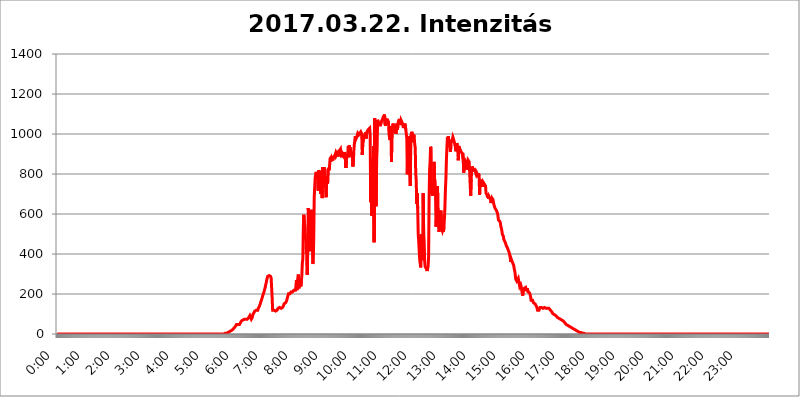
| Category | 2017.03.22. Intenzitás [W/m^2] |
|---|---|
| 0.0 | 0 |
| 0.0006944444444444445 | 0 |
| 0.001388888888888889 | 0 |
| 0.0020833333333333333 | 0 |
| 0.002777777777777778 | 0 |
| 0.003472222222222222 | 0 |
| 0.004166666666666667 | 0 |
| 0.004861111111111111 | 0 |
| 0.005555555555555556 | 0 |
| 0.0062499999999999995 | 0 |
| 0.006944444444444444 | 0 |
| 0.007638888888888889 | 0 |
| 0.008333333333333333 | 0 |
| 0.009027777777777779 | 0 |
| 0.009722222222222222 | 0 |
| 0.010416666666666666 | 0 |
| 0.011111111111111112 | 0 |
| 0.011805555555555555 | 0 |
| 0.012499999999999999 | 0 |
| 0.013194444444444444 | 0 |
| 0.013888888888888888 | 0 |
| 0.014583333333333332 | 0 |
| 0.015277777777777777 | 0 |
| 0.015972222222222224 | 0 |
| 0.016666666666666666 | 0 |
| 0.017361111111111112 | 0 |
| 0.018055555555555557 | 0 |
| 0.01875 | 0 |
| 0.019444444444444445 | 0 |
| 0.02013888888888889 | 0 |
| 0.020833333333333332 | 0 |
| 0.02152777777777778 | 0 |
| 0.022222222222222223 | 0 |
| 0.02291666666666667 | 0 |
| 0.02361111111111111 | 0 |
| 0.024305555555555556 | 0 |
| 0.024999999999999998 | 0 |
| 0.025694444444444447 | 0 |
| 0.02638888888888889 | 0 |
| 0.027083333333333334 | 0 |
| 0.027777777777777776 | 0 |
| 0.02847222222222222 | 0 |
| 0.029166666666666664 | 0 |
| 0.029861111111111113 | 0 |
| 0.030555555555555555 | 0 |
| 0.03125 | 0 |
| 0.03194444444444445 | 0 |
| 0.03263888888888889 | 0 |
| 0.03333333333333333 | 0 |
| 0.034027777777777775 | 0 |
| 0.034722222222222224 | 0 |
| 0.035416666666666666 | 0 |
| 0.036111111111111115 | 0 |
| 0.03680555555555556 | 0 |
| 0.0375 | 0 |
| 0.03819444444444444 | 0 |
| 0.03888888888888889 | 0 |
| 0.03958333333333333 | 0 |
| 0.04027777777777778 | 0 |
| 0.04097222222222222 | 0 |
| 0.041666666666666664 | 0 |
| 0.042361111111111106 | 0 |
| 0.04305555555555556 | 0 |
| 0.043750000000000004 | 0 |
| 0.044444444444444446 | 0 |
| 0.04513888888888889 | 0 |
| 0.04583333333333334 | 0 |
| 0.04652777777777778 | 0 |
| 0.04722222222222222 | 0 |
| 0.04791666666666666 | 0 |
| 0.04861111111111111 | 0 |
| 0.049305555555555554 | 0 |
| 0.049999999999999996 | 0 |
| 0.05069444444444445 | 0 |
| 0.051388888888888894 | 0 |
| 0.052083333333333336 | 0 |
| 0.05277777777777778 | 0 |
| 0.05347222222222222 | 0 |
| 0.05416666666666667 | 0 |
| 0.05486111111111111 | 0 |
| 0.05555555555555555 | 0 |
| 0.05625 | 0 |
| 0.05694444444444444 | 0 |
| 0.057638888888888885 | 0 |
| 0.05833333333333333 | 0 |
| 0.05902777777777778 | 0 |
| 0.059722222222222225 | 0 |
| 0.06041666666666667 | 0 |
| 0.061111111111111116 | 0 |
| 0.06180555555555556 | 0 |
| 0.0625 | 0 |
| 0.06319444444444444 | 0 |
| 0.06388888888888888 | 0 |
| 0.06458333333333334 | 0 |
| 0.06527777777777778 | 0 |
| 0.06597222222222222 | 0 |
| 0.06666666666666667 | 0 |
| 0.06736111111111111 | 0 |
| 0.06805555555555555 | 0 |
| 0.06874999999999999 | 0 |
| 0.06944444444444443 | 0 |
| 0.07013888888888889 | 0 |
| 0.07083333333333333 | 0 |
| 0.07152777777777779 | 0 |
| 0.07222222222222223 | 0 |
| 0.07291666666666667 | 0 |
| 0.07361111111111111 | 0 |
| 0.07430555555555556 | 0 |
| 0.075 | 0 |
| 0.07569444444444444 | 0 |
| 0.0763888888888889 | 0 |
| 0.07708333333333334 | 0 |
| 0.07777777777777778 | 0 |
| 0.07847222222222222 | 0 |
| 0.07916666666666666 | 0 |
| 0.0798611111111111 | 0 |
| 0.08055555555555556 | 0 |
| 0.08125 | 0 |
| 0.08194444444444444 | 0 |
| 0.08263888888888889 | 0 |
| 0.08333333333333333 | 0 |
| 0.08402777777777777 | 0 |
| 0.08472222222222221 | 0 |
| 0.08541666666666665 | 0 |
| 0.08611111111111112 | 0 |
| 0.08680555555555557 | 0 |
| 0.08750000000000001 | 0 |
| 0.08819444444444445 | 0 |
| 0.08888888888888889 | 0 |
| 0.08958333333333333 | 0 |
| 0.09027777777777778 | 0 |
| 0.09097222222222222 | 0 |
| 0.09166666666666667 | 0 |
| 0.09236111111111112 | 0 |
| 0.09305555555555556 | 0 |
| 0.09375 | 0 |
| 0.09444444444444444 | 0 |
| 0.09513888888888888 | 0 |
| 0.09583333333333333 | 0 |
| 0.09652777777777777 | 0 |
| 0.09722222222222222 | 0 |
| 0.09791666666666667 | 0 |
| 0.09861111111111111 | 0 |
| 0.09930555555555555 | 0 |
| 0.09999999999999999 | 0 |
| 0.10069444444444443 | 0 |
| 0.1013888888888889 | 0 |
| 0.10208333333333335 | 0 |
| 0.10277777777777779 | 0 |
| 0.10347222222222223 | 0 |
| 0.10416666666666667 | 0 |
| 0.10486111111111111 | 0 |
| 0.10555555555555556 | 0 |
| 0.10625 | 0 |
| 0.10694444444444444 | 0 |
| 0.1076388888888889 | 0 |
| 0.10833333333333334 | 0 |
| 0.10902777777777778 | 0 |
| 0.10972222222222222 | 0 |
| 0.1111111111111111 | 0 |
| 0.11180555555555556 | 0 |
| 0.11180555555555556 | 0 |
| 0.1125 | 0 |
| 0.11319444444444444 | 0 |
| 0.11388888888888889 | 0 |
| 0.11458333333333333 | 0 |
| 0.11527777777777777 | 0 |
| 0.11597222222222221 | 0 |
| 0.11666666666666665 | 0 |
| 0.1173611111111111 | 0 |
| 0.11805555555555557 | 0 |
| 0.11944444444444445 | 0 |
| 0.12013888888888889 | 0 |
| 0.12083333333333333 | 0 |
| 0.12152777777777778 | 0 |
| 0.12222222222222223 | 0 |
| 0.12291666666666667 | 0 |
| 0.12291666666666667 | 0 |
| 0.12361111111111112 | 0 |
| 0.12430555555555556 | 0 |
| 0.125 | 0 |
| 0.12569444444444444 | 0 |
| 0.12638888888888888 | 0 |
| 0.12708333333333333 | 0 |
| 0.16875 | 0 |
| 0.12847222222222224 | 0 |
| 0.12916666666666668 | 0 |
| 0.12986111111111112 | 0 |
| 0.13055555555555556 | 0 |
| 0.13125 | 0 |
| 0.13194444444444445 | 0 |
| 0.1326388888888889 | 0 |
| 0.13333333333333333 | 0 |
| 0.13402777777777777 | 0 |
| 0.13402777777777777 | 0 |
| 0.13472222222222222 | 0 |
| 0.13541666666666666 | 0 |
| 0.1361111111111111 | 0 |
| 0.13749999999999998 | 0 |
| 0.13819444444444443 | 0 |
| 0.1388888888888889 | 0 |
| 0.13958333333333334 | 0 |
| 0.14027777777777778 | 0 |
| 0.14097222222222222 | 0 |
| 0.14166666666666666 | 0 |
| 0.1423611111111111 | 0 |
| 0.14305555555555557 | 0 |
| 0.14375000000000002 | 0 |
| 0.14444444444444446 | 0 |
| 0.1451388888888889 | 0 |
| 0.1451388888888889 | 0 |
| 0.14652777777777778 | 0 |
| 0.14722222222222223 | 0 |
| 0.14791666666666667 | 0 |
| 0.1486111111111111 | 0 |
| 0.14930555555555555 | 0 |
| 0.15 | 0 |
| 0.15069444444444444 | 0 |
| 0.15138888888888888 | 0 |
| 0.15208333333333332 | 0 |
| 0.15277777777777776 | 0 |
| 0.15347222222222223 | 0 |
| 0.15416666666666667 | 0 |
| 0.15486111111111112 | 0 |
| 0.15555555555555556 | 0 |
| 0.15625 | 0 |
| 0.15694444444444444 | 0 |
| 0.15763888888888888 | 0 |
| 0.15833333333333333 | 0 |
| 0.15902777777777777 | 0 |
| 0.15972222222222224 | 0 |
| 0.16041666666666668 | 0 |
| 0.16111111111111112 | 0 |
| 0.16180555555555556 | 0 |
| 0.1625 | 0 |
| 0.16319444444444445 | 0 |
| 0.1638888888888889 | 0 |
| 0.16458333333333333 | 0 |
| 0.16527777777777777 | 0 |
| 0.16597222222222222 | 0 |
| 0.16666666666666666 | 0 |
| 0.1673611111111111 | 0 |
| 0.16805555555555554 | 0 |
| 0.16874999999999998 | 0 |
| 0.16944444444444443 | 0 |
| 0.17013888888888887 | 0 |
| 0.1708333333333333 | 0 |
| 0.17152777777777775 | 0 |
| 0.17222222222222225 | 0 |
| 0.1729166666666667 | 0 |
| 0.17361111111111113 | 0 |
| 0.17430555555555557 | 0 |
| 0.17500000000000002 | 0 |
| 0.17569444444444446 | 0 |
| 0.1763888888888889 | 0 |
| 0.17708333333333334 | 0 |
| 0.17777777777777778 | 0 |
| 0.17847222222222223 | 0 |
| 0.17916666666666667 | 0 |
| 0.1798611111111111 | 0 |
| 0.18055555555555555 | 0 |
| 0.18125 | 0 |
| 0.18194444444444444 | 0 |
| 0.1826388888888889 | 0 |
| 0.18333333333333335 | 0 |
| 0.1840277777777778 | 0 |
| 0.18472222222222223 | 0 |
| 0.18541666666666667 | 0 |
| 0.18611111111111112 | 0 |
| 0.18680555555555556 | 0 |
| 0.1875 | 0 |
| 0.18819444444444444 | 0 |
| 0.18888888888888888 | 0 |
| 0.18958333333333333 | 0 |
| 0.19027777777777777 | 0 |
| 0.1909722222222222 | 0 |
| 0.19166666666666665 | 0 |
| 0.19236111111111112 | 0 |
| 0.19305555555555554 | 0 |
| 0.19375 | 0 |
| 0.19444444444444445 | 0 |
| 0.1951388888888889 | 0 |
| 0.19583333333333333 | 0 |
| 0.19652777777777777 | 0 |
| 0.19722222222222222 | 0 |
| 0.19791666666666666 | 0 |
| 0.1986111111111111 | 0 |
| 0.19930555555555554 | 0 |
| 0.19999999999999998 | 0 |
| 0.20069444444444443 | 0 |
| 0.20138888888888887 | 0 |
| 0.2020833333333333 | 0 |
| 0.2027777777777778 | 0 |
| 0.2034722222222222 | 0 |
| 0.2041666666666667 | 0 |
| 0.20486111111111113 | 0 |
| 0.20555555555555557 | 0 |
| 0.20625000000000002 | 0 |
| 0.20694444444444446 | 0 |
| 0.2076388888888889 | 0 |
| 0.20833333333333334 | 0 |
| 0.20902777777777778 | 0 |
| 0.20972222222222223 | 0 |
| 0.21041666666666667 | 0 |
| 0.2111111111111111 | 0 |
| 0.21180555555555555 | 0 |
| 0.2125 | 0 |
| 0.21319444444444444 | 0 |
| 0.2138888888888889 | 0 |
| 0.21458333333333335 | 0 |
| 0.2152777777777778 | 0 |
| 0.21597222222222223 | 0 |
| 0.21666666666666667 | 0 |
| 0.21736111111111112 | 0 |
| 0.21805555555555556 | 0 |
| 0.21875 | 0 |
| 0.21944444444444444 | 0 |
| 0.22013888888888888 | 0 |
| 0.22083333333333333 | 0 |
| 0.22152777777777777 | 0 |
| 0.2222222222222222 | 0 |
| 0.22291666666666665 | 0 |
| 0.2236111111111111 | 0 |
| 0.22430555555555556 | 0 |
| 0.225 | 0 |
| 0.22569444444444445 | 0 |
| 0.2263888888888889 | 0 |
| 0.22708333333333333 | 0 |
| 0.22777777777777777 | 0 |
| 0.22847222222222222 | 0 |
| 0.22916666666666666 | 0 |
| 0.2298611111111111 | 0 |
| 0.23055555555555554 | 0 |
| 0.23124999999999998 | 0 |
| 0.23194444444444443 | 0 |
| 0.23263888888888887 | 0 |
| 0.2333333333333333 | 0 |
| 0.2340277777777778 | 0 |
| 0.2347222222222222 | 0 |
| 0.2354166666666667 | 3.525 |
| 0.23611111111111113 | 3.525 |
| 0.23680555555555557 | 3.525 |
| 0.23750000000000002 | 3.525 |
| 0.23819444444444446 | 3.525 |
| 0.2388888888888889 | 3.525 |
| 0.23958333333333334 | 7.887 |
| 0.24027777777777778 | 7.887 |
| 0.24097222222222223 | 12.257 |
| 0.24166666666666667 | 12.257 |
| 0.2423611111111111 | 12.257 |
| 0.24305555555555555 | 12.257 |
| 0.24375 | 16.636 |
| 0.24444444444444446 | 16.636 |
| 0.24513888888888888 | 21.024 |
| 0.24583333333333335 | 21.024 |
| 0.2465277777777778 | 25.419 |
| 0.24722222222222223 | 25.419 |
| 0.24791666666666667 | 29.823 |
| 0.24861111111111112 | 34.234 |
| 0.24930555555555556 | 34.234 |
| 0.25 | 38.653 |
| 0.25069444444444444 | 43.079 |
| 0.2513888888888889 | 47.511 |
| 0.2520833333333333 | 47.511 |
| 0.25277777777777777 | 47.511 |
| 0.2534722222222222 | 47.511 |
| 0.25416666666666665 | 47.511 |
| 0.2548611111111111 | 47.511 |
| 0.2555555555555556 | 47.511 |
| 0.25625000000000003 | 51.951 |
| 0.2569444444444445 | 56.398 |
| 0.2576388888888889 | 60.85 |
| 0.25833333333333336 | 65.31 |
| 0.2590277777777778 | 65.31 |
| 0.25972222222222224 | 69.775 |
| 0.2604166666666667 | 69.775 |
| 0.2611111111111111 | 74.246 |
| 0.26180555555555557 | 74.246 |
| 0.2625 | 74.246 |
| 0.26319444444444445 | 74.246 |
| 0.2638888888888889 | 74.246 |
| 0.26458333333333334 | 74.246 |
| 0.2652777777777778 | 69.775 |
| 0.2659722222222222 | 69.775 |
| 0.26666666666666666 | 74.246 |
| 0.2673611111111111 | 74.246 |
| 0.26805555555555555 | 78.722 |
| 0.26875 | 83.205 |
| 0.26944444444444443 | 87.692 |
| 0.2701388888888889 | 92.184 |
| 0.2708333333333333 | 92.184 |
| 0.27152777777777776 | 87.692 |
| 0.2722222222222222 | 74.246 |
| 0.27291666666666664 | 78.722 |
| 0.2736111111111111 | 83.205 |
| 0.2743055555555555 | 96.682 |
| 0.27499999999999997 | 101.184 |
| 0.27569444444444446 | 105.69 |
| 0.27638888888888885 | 110.201 |
| 0.27708333333333335 | 114.716 |
| 0.2777777777777778 | 119.235 |
| 0.27847222222222223 | 119.235 |
| 0.2791666666666667 | 119.235 |
| 0.2798611111111111 | 123.758 |
| 0.28055555555555556 | 123.758 |
| 0.28125 | 119.235 |
| 0.28194444444444444 | 128.284 |
| 0.2826388888888889 | 132.814 |
| 0.2833333333333333 | 137.347 |
| 0.28402777777777777 | 141.884 |
| 0.2847222222222222 | 150.964 |
| 0.28541666666666665 | 160.056 |
| 0.28611111111111115 | 164.605 |
| 0.28680555555555554 | 173.709 |
| 0.28750000000000003 | 182.82 |
| 0.2881944444444445 | 191.937 |
| 0.2888888888888889 | 196.497 |
| 0.28958333333333336 | 205.62 |
| 0.2902777777777778 | 214.746 |
| 0.29097222222222224 | 219.309 |
| 0.2916666666666667 | 233 |
| 0.2923611111111111 | 246.689 |
| 0.29305555555555557 | 255.813 |
| 0.29375 | 269.49 |
| 0.29444444444444445 | 274.047 |
| 0.2951388888888889 | 287.709 |
| 0.29583333333333334 | 287.709 |
| 0.2965277777777778 | 292.259 |
| 0.2972222222222222 | 292.259 |
| 0.29791666666666666 | 296.808 |
| 0.2986111111111111 | 292.259 |
| 0.29930555555555555 | 287.709 |
| 0.3 | 278.603 |
| 0.30069444444444443 | 278.603 |
| 0.3013888888888889 | 182.82 |
| 0.3020833333333333 | 119.235 |
| 0.30277777777777776 | 119.235 |
| 0.3034722222222222 | 119.235 |
| 0.30416666666666664 | 119.235 |
| 0.3048611111111111 | 114.716 |
| 0.3055555555555555 | 114.716 |
| 0.30624999999999997 | 114.716 |
| 0.3069444444444444 | 114.716 |
| 0.3076388888888889 | 119.235 |
| 0.30833333333333335 | 119.235 |
| 0.3090277777777778 | 123.758 |
| 0.30972222222222223 | 128.284 |
| 0.3104166666666667 | 128.284 |
| 0.3111111111111111 | 132.814 |
| 0.31180555555555556 | 132.814 |
| 0.3125 | 132.814 |
| 0.31319444444444444 | 132.814 |
| 0.3138888888888889 | 128.284 |
| 0.3145833333333333 | 128.284 |
| 0.31527777777777777 | 128.284 |
| 0.3159722222222222 | 132.814 |
| 0.31666666666666665 | 137.347 |
| 0.31736111111111115 | 141.884 |
| 0.31805555555555554 | 150.964 |
| 0.31875000000000003 | 150.964 |
| 0.3194444444444445 | 155.509 |
| 0.3201388888888889 | 155.509 |
| 0.32083333333333336 | 155.509 |
| 0.3215277777777778 | 164.605 |
| 0.32222222222222224 | 173.709 |
| 0.3229166666666667 | 182.82 |
| 0.3236111111111111 | 191.937 |
| 0.32430555555555557 | 201.058 |
| 0.325 | 205.62 |
| 0.32569444444444445 | 205.62 |
| 0.3263888888888889 | 201.058 |
| 0.32708333333333334 | 205.62 |
| 0.3277777777777778 | 210.182 |
| 0.3284722222222222 | 210.182 |
| 0.32916666666666666 | 210.182 |
| 0.3298611111111111 | 210.182 |
| 0.33055555555555555 | 210.182 |
| 0.33125 | 210.182 |
| 0.33194444444444443 | 219.309 |
| 0.3326388888888889 | 214.746 |
| 0.3333333333333333 | 214.746 |
| 0.3340277777777778 | 219.309 |
| 0.3347222222222222 | 237.564 |
| 0.3354166666666667 | 269.49 |
| 0.3361111111111111 | 219.309 |
| 0.3368055555555556 | 214.746 |
| 0.33749999999999997 | 223.873 |
| 0.33819444444444446 | 296.808 |
| 0.33888888888888885 | 228.436 |
| 0.33958333333333335 | 233 |
| 0.34027777777777773 | 260.373 |
| 0.34097222222222223 | 246.689 |
| 0.3416666666666666 | 237.564 |
| 0.3423611111111111 | 264.932 |
| 0.3430555555555555 | 292.259 |
| 0.34375 | 355.712 |
| 0.3444444444444445 | 373.729 |
| 0.3451388888888889 | 532.513 |
| 0.3458333333333334 | 596.45 |
| 0.34652777777777777 | 553.986 |
| 0.34722222222222227 | 541.121 |
| 0.34791666666666665 | 480.356 |
| 0.34861111111111115 | 471.582 |
| 0.34930555555555554 | 400.638 |
| 0.35000000000000003 | 431.833 |
| 0.3506944444444444 | 296.808 |
| 0.3513888888888889 | 471.582 |
| 0.3520833333333333 | 629.948 |
| 0.3527777777777778 | 583.779 |
| 0.3534722222222222 | 558.261 |
| 0.3541666666666667 | 422.943 |
| 0.3548611111111111 | 414.035 |
| 0.35555555555555557 | 592.233 |
| 0.35625 | 592.233 |
| 0.35694444444444445 | 621.613 |
| 0.3576388888888889 | 519.555 |
| 0.35833333333333334 | 351.198 |
| 0.3590277777777778 | 360.221 |
| 0.3597222222222222 | 475.972 |
| 0.36041666666666666 | 683.473 |
| 0.3611111111111111 | 735.89 |
| 0.36180555555555555 | 783.342 |
| 0.3625 | 783.342 |
| 0.36319444444444443 | 810.641 |
| 0.3638888888888889 | 791.169 |
| 0.3645833333333333 | 791.169 |
| 0.3652777777777778 | 775.492 |
| 0.3659722222222222 | 715.858 |
| 0.3666666666666667 | 818.392 |
| 0.3673611111111111 | 814.519 |
| 0.3680555555555556 | 806.757 |
| 0.36874999999999997 | 767.62 |
| 0.36944444444444446 | 699.717 |
| 0.37013888888888885 | 814.519 |
| 0.37083333333333335 | 798.974 |
| 0.37152777777777773 | 679.395 |
| 0.37222222222222223 | 833.834 |
| 0.3729166666666666 | 833.834 |
| 0.3736111111111111 | 810.641 |
| 0.3743055555555555 | 833.834 |
| 0.375 | 791.169 |
| 0.3756944444444445 | 759.723 |
| 0.3763888888888889 | 731.896 |
| 0.3770833333333334 | 683.473 |
| 0.37777777777777777 | 759.723 |
| 0.37847222222222227 | 787.258 |
| 0.37916666666666665 | 751.803 |
| 0.37986111111111115 | 822.26 |
| 0.38055555555555554 | 829.981 |
| 0.38125000000000003 | 818.392 |
| 0.3819444444444444 | 841.526 |
| 0.3826388888888889 | 875.918 |
| 0.3833333333333333 | 879.719 |
| 0.3840277777777778 | 883.516 |
| 0.3847222222222222 | 868.305 |
| 0.3854166666666667 | 868.305 |
| 0.3861111111111111 | 872.114 |
| 0.38680555555555557 | 872.114 |
| 0.3875 | 868.305 |
| 0.38819444444444445 | 887.309 |
| 0.3888888888888889 | 891.099 |
| 0.38958333333333334 | 894.885 |
| 0.3902777777777778 | 902.447 |
| 0.3909722222222222 | 891.099 |
| 0.39166666666666666 | 894.885 |
| 0.3923611111111111 | 902.447 |
| 0.39305555555555555 | 906.223 |
| 0.39375 | 887.309 |
| 0.39444444444444443 | 906.223 |
| 0.3951388888888889 | 913.766 |
| 0.3958333333333333 | 909.996 |
| 0.3965277777777778 | 913.766 |
| 0.3972222222222222 | 925.06 |
| 0.3979166666666667 | 898.668 |
| 0.3986111111111111 | 883.516 |
| 0.3993055555555556 | 906.223 |
| 0.39999999999999997 | 906.223 |
| 0.40069444444444446 | 902.447 |
| 0.40138888888888885 | 891.099 |
| 0.40208333333333335 | 898.668 |
| 0.40277777777777773 | 909.996 |
| 0.40347222222222223 | 883.516 |
| 0.4041666666666666 | 891.099 |
| 0.4048611111111111 | 829.981 |
| 0.4055555555555555 | 868.305 |
| 0.40625 | 887.309 |
| 0.4069444444444445 | 894.885 |
| 0.4076388888888889 | 887.309 |
| 0.4083333333333334 | 940.082 |
| 0.40902777777777777 | 883.516 |
| 0.40972222222222227 | 943.832 |
| 0.41041666666666665 | 921.298 |
| 0.41111111111111115 | 932.576 |
| 0.41180555555555554 | 891.099 |
| 0.41250000000000003 | 909.996 |
| 0.4131944444444444 | 894.885 |
| 0.4138888888888889 | 906.223 |
| 0.4145833333333333 | 837.682 |
| 0.4152777777777778 | 853.029 |
| 0.4159722222222222 | 917.534 |
| 0.4166666666666667 | 947.58 |
| 0.4173611111111111 | 970.034 |
| 0.41805555555555557 | 988.714 |
| 0.41875 | 973.772 |
| 0.41944444444444445 | 977.508 |
| 0.4201388888888889 | 984.98 |
| 0.42083333333333334 | 988.714 |
| 0.4215277777777778 | 1003.65 |
| 0.4222222222222222 | 999.916 |
| 0.42291666666666666 | 996.182 |
| 0.4236111111111111 | 999.916 |
| 0.42430555555555555 | 1003.65 |
| 0.425 | 1003.65 |
| 0.42569444444444443 | 1011.118 |
| 0.4263888888888889 | 1011.118 |
| 0.4270833333333333 | 999.916 |
| 0.4277777777777778 | 894.885 |
| 0.4284722222222222 | 947.58 |
| 0.4291666666666667 | 984.98 |
| 0.4298611111111111 | 977.508 |
| 0.4305555555555556 | 988.714 |
| 0.43124999999999997 | 996.182 |
| 0.43194444444444446 | 999.916 |
| 0.43263888888888885 | 1007.383 |
| 0.43333333333333335 | 977.508 |
| 0.43402777777777773 | 1007.383 |
| 0.43472222222222223 | 1003.65 |
| 0.4354166666666666 | 1007.383 |
| 0.4361111111111111 | 1022.323 |
| 0.4368055555555555 | 1022.323 |
| 0.4375 | 1018.587 |
| 0.4381944444444445 | 1029.798 |
| 0.4388888888888889 | 992.448 |
| 0.4395833333333334 | 658.909 |
| 0.44027777777777777 | 875.918 |
| 0.44097222222222227 | 592.233 |
| 0.44166666666666665 | 783.342 |
| 0.44236111111111115 | 650.667 |
| 0.44305555555555554 | 845.365 |
| 0.44375000000000003 | 940.082 |
| 0.4444444444444444 | 458.38 |
| 0.4451388888888889 | 1078.555 |
| 0.4458333333333333 | 1037.277 |
| 0.4465277777777778 | 751.803 |
| 0.4472222222222222 | 638.256 |
| 0.4479166666666667 | 868.305 |
| 0.4486111111111111 | 928.819 |
| 0.44930555555555557 | 1071.027 |
| 0.45 | 1067.267 |
| 0.45069444444444445 | 1052.255 |
| 0.4513888888888889 | 1044.762 |
| 0.45208333333333334 | 1048.508 |
| 0.4527777777777778 | 1044.762 |
| 0.4534722222222222 | 1044.762 |
| 0.45416666666666666 | 1041.019 |
| 0.4548611111111111 | 1063.51 |
| 0.45555555555555555 | 1067.267 |
| 0.45625 | 1074.789 |
| 0.45694444444444443 | 1082.324 |
| 0.4576388888888889 | 1086.097 |
| 0.4583333333333333 | 1082.324 |
| 0.4590277777777778 | 1097.437 |
| 0.4597222222222222 | 1048.508 |
| 0.4604166666666667 | 1041.019 |
| 0.4611111111111111 | 1071.027 |
| 0.4618055555555556 | 1074.789 |
| 0.46249999999999997 | 1074.789 |
| 0.46319444444444446 | 1071.027 |
| 0.46388888888888885 | 1071.027 |
| 0.46458333333333335 | 1059.756 |
| 0.46527777777777773 | 999.916 |
| 0.46597222222222223 | 999.916 |
| 0.4666666666666666 | 970.034 |
| 0.4673611111111111 | 1037.277 |
| 0.4680555555555555 | 1011.118 |
| 0.46875 | 860.676 |
| 0.4694444444444445 | 1003.65 |
| 0.4701388888888889 | 1014.852 |
| 0.4708333333333334 | 1052.255 |
| 0.47152777777777777 | 1037.277 |
| 0.47222222222222227 | 1022.323 |
| 0.47291666666666665 | 1007.383 |
| 0.47361111111111115 | 1041.019 |
| 0.47430555555555554 | 1029.798 |
| 0.47500000000000003 | 999.916 |
| 0.4756944444444444 | 1003.65 |
| 0.4763888888888889 | 1052.255 |
| 0.4770833333333333 | 1022.323 |
| 0.4777777777777778 | 1041.019 |
| 0.4784722222222222 | 1063.51 |
| 0.4791666666666667 | 1067.267 |
| 0.4798611111111111 | 1074.789 |
| 0.48055555555555557 | 1044.762 |
| 0.48125 | 1059.756 |
| 0.48194444444444445 | 1071.027 |
| 0.4826388888888889 | 1074.789 |
| 0.48333333333333334 | 1059.756 |
| 0.4840277777777778 | 1059.756 |
| 0.4847222222222222 | 1048.508 |
| 0.48541666666666666 | 1029.798 |
| 0.4861111111111111 | 1026.06 |
| 0.48680555555555555 | 1026.06 |
| 0.4875 | 1052.255 |
| 0.48819444444444443 | 1048.508 |
| 0.4888888888888889 | 1022.323 |
| 0.4895833333333333 | 999.916 |
| 0.4902777777777778 | 977.508 |
| 0.4909722222222222 | 798.974 |
| 0.4916666666666667 | 962.555 |
| 0.4923611111111111 | 868.305 |
| 0.4930555555555556 | 798.974 |
| 0.49374999999999997 | 988.714 |
| 0.49444444444444446 | 798.974 |
| 0.49513888888888885 | 739.877 |
| 0.49583333333333335 | 988.714 |
| 0.49652777777777773 | 992.448 |
| 0.49722222222222223 | 1011.118 |
| 0.4979166666666666 | 1007.383 |
| 0.4986111111111111 | 988.714 |
| 0.4993055555555555 | 958.814 |
| 0.5 | 996.182 |
| 0.5006944444444444 | 981.244 |
| 0.5013888888888889 | 947.58 |
| 0.5020833333333333 | 932.576 |
| 0.5027777777777778 | 802.868 |
| 0.5034722222222222 | 767.62 |
| 0.5041666666666667 | 650.667 |
| 0.5048611111111111 | 703.762 |
| 0.5055555555555555 | 625.784 |
| 0.50625 | 502.192 |
| 0.5069444444444444 | 462.786 |
| 0.5076388888888889 | 418.492 |
| 0.5083333333333333 | 373.729 |
| 0.5090277777777777 | 378.224 |
| 0.5097222222222222 | 333.113 |
| 0.5104166666666666 | 497.836 |
| 0.5111111111111112 | 418.492 |
| 0.5118055555555555 | 369.23 |
| 0.5125000000000001 | 400.638 |
| 0.5131944444444444 | 703.762 |
| 0.513888888888889 | 506.542 |
| 0.5145833333333333 | 467.187 |
| 0.5152777777777778 | 364.728 |
| 0.5159722222222222 | 337.639 |
| 0.5166666666666667 | 342.162 |
| 0.517361111111111 | 333.113 |
| 0.5180555555555556 | 324.052 |
| 0.5187499999999999 | 314.98 |
| 0.5194444444444445 | 328.584 |
| 0.5201388888888888 | 337.639 |
| 0.5208333333333334 | 387.202 |
| 0.5215277777777778 | 675.311 |
| 0.5222222222222223 | 822.26 |
| 0.5229166666666667 | 860.676 |
| 0.5236111111111111 | 936.33 |
| 0.5243055555555556 | 928.819 |
| 0.525 | 703.762 |
| 0.5256944444444445 | 699.717 |
| 0.5263888888888889 | 691.608 |
| 0.5270833333333333 | 711.832 |
| 0.5277777777777778 | 735.89 |
| 0.5284722222222222 | 860.676 |
| 0.5291666666666667 | 775.492 |
| 0.5298611111111111 | 767.62 |
| 0.5305555555555556 | 695.666 |
| 0.53125 | 536.82 |
| 0.5319444444444444 | 579.542 |
| 0.5326388888888889 | 715.858 |
| 0.5333333333333333 | 739.877 |
| 0.5340277777777778 | 592.233 |
| 0.5347222222222222 | 583.779 |
| 0.5354166666666667 | 510.885 |
| 0.5361111111111111 | 541.121 |
| 0.5368055555555555 | 532.513 |
| 0.5375 | 609.062 |
| 0.5381944444444444 | 617.436 |
| 0.5388888888888889 | 545.416 |
| 0.5395833333333333 | 523.88 |
| 0.5402777777777777 | 515.223 |
| 0.5409722222222222 | 523.88 |
| 0.5416666666666666 | 510.885 |
| 0.5423611111111112 | 536.82 |
| 0.5430555555555555 | 579.542 |
| 0.5437500000000001 | 638.256 |
| 0.5444444444444444 | 723.889 |
| 0.545138888888889 | 779.42 |
| 0.5458333333333333 | 872.114 |
| 0.5465277777777778 | 932.576 |
| 0.5472222222222222 | 984.98 |
| 0.5479166666666667 | 973.772 |
| 0.548611111111111 | 988.714 |
| 0.5493055555555556 | 955.071 |
| 0.5499999999999999 | 966.295 |
| 0.5506944444444445 | 932.576 |
| 0.5513888888888888 | 909.996 |
| 0.5520833333333334 | 943.832 |
| 0.5527777777777778 | 966.295 |
| 0.5534722222222223 | 962.555 |
| 0.5541666666666667 | 973.772 |
| 0.5548611111111111 | 984.98 |
| 0.5555555555555556 | 977.508 |
| 0.55625 | 977.508 |
| 0.5569444444444445 | 958.814 |
| 0.5576388888888889 | 947.58 |
| 0.5583333333333333 | 936.33 |
| 0.5590277777777778 | 913.766 |
| 0.5597222222222222 | 917.534 |
| 0.5604166666666667 | 955.071 |
| 0.5611111111111111 | 951.327 |
| 0.5618055555555556 | 913.766 |
| 0.5625 | 868.305 |
| 0.5631944444444444 | 940.082 |
| 0.5638888888888889 | 928.819 |
| 0.5645833333333333 | 925.06 |
| 0.5652777777777778 | 921.298 |
| 0.5659722222222222 | 913.766 |
| 0.5666666666666667 | 909.996 |
| 0.5673611111111111 | 906.223 |
| 0.5680555555555555 | 898.668 |
| 0.56875 | 906.223 |
| 0.5694444444444444 | 864.493 |
| 0.5701388888888889 | 806.757 |
| 0.5708333333333333 | 845.365 |
| 0.5715277777777777 | 856.855 |
| 0.5722222222222222 | 868.305 |
| 0.5729166666666666 | 872.114 |
| 0.5736111111111112 | 860.676 |
| 0.5743055555555555 | 822.26 |
| 0.5750000000000001 | 853.029 |
| 0.5756944444444444 | 822.26 |
| 0.576388888888889 | 868.305 |
| 0.5770833333333333 | 864.493 |
| 0.5777777777777778 | 860.676 |
| 0.5784722222222222 | 860.676 |
| 0.5791666666666667 | 864.493 |
| 0.579861111111111 | 691.608 |
| 0.5805555555555556 | 771.559 |
| 0.5812499999999999 | 818.392 |
| 0.5819444444444445 | 837.682 |
| 0.5826388888888888 | 829.981 |
| 0.5833333333333334 | 818.392 |
| 0.5840277777777778 | 818.392 |
| 0.5847222222222223 | 822.26 |
| 0.5854166666666667 | 822.26 |
| 0.5861111111111111 | 814.519 |
| 0.5868055555555556 | 810.641 |
| 0.5875 | 798.974 |
| 0.5881944444444445 | 806.757 |
| 0.5888888888888889 | 802.868 |
| 0.5895833333333333 | 795.074 |
| 0.5902777777777778 | 783.342 |
| 0.5909722222222222 | 802.868 |
| 0.5916666666666667 | 787.258 |
| 0.5923611111111111 | 695.666 |
| 0.5930555555555556 | 771.559 |
| 0.59375 | 771.559 |
| 0.5944444444444444 | 759.723 |
| 0.5951388888888889 | 755.766 |
| 0.5958333333333333 | 743.859 |
| 0.5965277777777778 | 735.89 |
| 0.5972222222222222 | 759.723 |
| 0.5979166666666667 | 763.674 |
| 0.5986111111111111 | 759.723 |
| 0.5993055555555555 | 747.834 |
| 0.6 | 747.834 |
| 0.6006944444444444 | 739.877 |
| 0.6013888888888889 | 703.762 |
| 0.6020833333333333 | 703.762 |
| 0.6027777777777777 | 695.666 |
| 0.6034722222222222 | 683.473 |
| 0.6041666666666666 | 695.666 |
| 0.6048611111111112 | 675.311 |
| 0.6055555555555555 | 687.544 |
| 0.6062500000000001 | 687.544 |
| 0.6069444444444444 | 687.544 |
| 0.607638888888889 | 671.22 |
| 0.6083333333333333 | 654.791 |
| 0.6090277777777778 | 658.909 |
| 0.6097222222222222 | 679.395 |
| 0.6104166666666667 | 675.311 |
| 0.611111111111111 | 671.22 |
| 0.6118055555555556 | 658.909 |
| 0.6124999999999999 | 646.537 |
| 0.6131944444444445 | 642.4 |
| 0.6138888888888888 | 629.948 |
| 0.6145833333333334 | 625.784 |
| 0.6152777777777778 | 625.784 |
| 0.6159722222222223 | 617.436 |
| 0.6166666666666667 | 617.436 |
| 0.6173611111111111 | 604.864 |
| 0.6180555555555556 | 592.233 |
| 0.61875 | 571.049 |
| 0.6194444444444445 | 566.793 |
| 0.6201388888888889 | 566.793 |
| 0.6208333333333333 | 562.53 |
| 0.6215277777777778 | 553.986 |
| 0.6222222222222222 | 536.82 |
| 0.6229166666666667 | 528.2 |
| 0.6236111111111111 | 515.223 |
| 0.6243055555555556 | 497.836 |
| 0.625 | 497.836 |
| 0.6256944444444444 | 489.108 |
| 0.6263888888888889 | 471.582 |
| 0.6270833333333333 | 467.187 |
| 0.6277777777777778 | 462.786 |
| 0.6284722222222222 | 462.786 |
| 0.6291666666666667 | 449.551 |
| 0.6298611111111111 | 440.702 |
| 0.6305555555555555 | 440.702 |
| 0.63125 | 431.833 |
| 0.6319444444444444 | 431.833 |
| 0.6326388888888889 | 418.492 |
| 0.6333333333333333 | 414.035 |
| 0.6340277777777777 | 405.108 |
| 0.6347222222222222 | 391.685 |
| 0.6354166666666666 | 378.224 |
| 0.6361111111111112 | 360.221 |
| 0.6368055555555555 | 373.729 |
| 0.6375000000000001 | 369.23 |
| 0.6381944444444444 | 360.221 |
| 0.638888888888889 | 364.728 |
| 0.6395833333333333 | 360.221 |
| 0.6402777777777778 | 342.162 |
| 0.6409722222222222 | 324.052 |
| 0.6416666666666667 | 314.98 |
| 0.642361111111111 | 296.808 |
| 0.6430555555555556 | 274.047 |
| 0.6437499999999999 | 274.047 |
| 0.6444444444444445 | 264.932 |
| 0.6451388888888888 | 269.49 |
| 0.6458333333333334 | 269.49 |
| 0.6465277777777778 | 278.603 |
| 0.6472222222222223 | 274.047 |
| 0.6479166666666667 | 251.251 |
| 0.6486111111111111 | 237.564 |
| 0.6493055555555556 | 242.127 |
| 0.65 | 246.689 |
| 0.6506944444444445 | 237.564 |
| 0.6513888888888889 | 219.309 |
| 0.6520833333333333 | 205.62 |
| 0.6527777777777778 | 191.937 |
| 0.6534722222222222 | 210.182 |
| 0.6541666666666667 | 210.182 |
| 0.6548611111111111 | 228.436 |
| 0.6555555555555556 | 228.436 |
| 0.65625 | 228.436 |
| 0.6569444444444444 | 233 |
| 0.6576388888888889 | 228.436 |
| 0.6583333333333333 | 214.746 |
| 0.6590277777777778 | 228.436 |
| 0.6597222222222222 | 223.873 |
| 0.6604166666666667 | 210.182 |
| 0.6611111111111111 | 210.182 |
| 0.6618055555555555 | 210.182 |
| 0.6625 | 205.62 |
| 0.6631944444444444 | 196.497 |
| 0.6638888888888889 | 187.378 |
| 0.6645833333333333 | 169.156 |
| 0.6652777777777777 | 173.709 |
| 0.6659722222222222 | 169.156 |
| 0.6666666666666666 | 169.156 |
| 0.6673611111111111 | 169.156 |
| 0.6680555555555556 | 155.509 |
| 0.6687500000000001 | 155.509 |
| 0.6694444444444444 | 150.964 |
| 0.6701388888888888 | 150.964 |
| 0.6708333333333334 | 146.423 |
| 0.6715277777777778 | 150.964 |
| 0.6722222222222222 | 137.347 |
| 0.6729166666666666 | 128.284 |
| 0.6736111111111112 | 119.235 |
| 0.6743055555555556 | 119.235 |
| 0.6749999999999999 | 119.235 |
| 0.6756944444444444 | 119.235 |
| 0.6763888888888889 | 123.758 |
| 0.6770833333333334 | 132.814 |
| 0.6777777777777777 | 132.814 |
| 0.6784722222222223 | 132.814 |
| 0.6791666666666667 | 132.814 |
| 0.6798611111111111 | 128.284 |
| 0.6805555555555555 | 128.284 |
| 0.68125 | 128.284 |
| 0.6819444444444445 | 128.284 |
| 0.6826388888888889 | 132.814 |
| 0.6833333333333332 | 132.814 |
| 0.6840277777777778 | 128.284 |
| 0.6847222222222222 | 128.284 |
| 0.6854166666666667 | 128.284 |
| 0.686111111111111 | 128.284 |
| 0.6868055555555556 | 128.284 |
| 0.6875 | 128.284 |
| 0.6881944444444444 | 128.284 |
| 0.688888888888889 | 123.758 |
| 0.6895833333333333 | 128.284 |
| 0.6902777777777778 | 123.758 |
| 0.6909722222222222 | 123.758 |
| 0.6916666666666668 | 119.235 |
| 0.6923611111111111 | 119.235 |
| 0.6930555555555555 | 114.716 |
| 0.69375 | 110.201 |
| 0.6944444444444445 | 105.69 |
| 0.6951388888888889 | 101.184 |
| 0.6958333333333333 | 101.184 |
| 0.6965277777777777 | 96.682 |
| 0.6972222222222223 | 96.682 |
| 0.6979166666666666 | 92.184 |
| 0.6986111111111111 | 92.184 |
| 0.6993055555555556 | 92.184 |
| 0.7000000000000001 | 87.692 |
| 0.7006944444444444 | 87.692 |
| 0.7013888888888888 | 83.205 |
| 0.7020833333333334 | 83.205 |
| 0.7027777777777778 | 78.722 |
| 0.7034722222222222 | 78.722 |
| 0.7041666666666666 | 74.246 |
| 0.7048611111111112 | 74.246 |
| 0.7055555555555556 | 74.246 |
| 0.7062499999999999 | 74.246 |
| 0.7069444444444444 | 74.246 |
| 0.7076388888888889 | 69.775 |
| 0.7083333333333334 | 69.775 |
| 0.7090277777777777 | 65.31 |
| 0.7097222222222223 | 65.31 |
| 0.7104166666666667 | 60.85 |
| 0.7111111111111111 | 60.85 |
| 0.7118055555555555 | 56.398 |
| 0.7125 | 56.398 |
| 0.7131944444444445 | 51.951 |
| 0.7138888888888889 | 47.511 |
| 0.7145833333333332 | 47.511 |
| 0.7152777777777778 | 47.511 |
| 0.7159722222222222 | 43.079 |
| 0.7166666666666667 | 43.079 |
| 0.717361111111111 | 38.653 |
| 0.7180555555555556 | 38.653 |
| 0.71875 | 38.653 |
| 0.7194444444444444 | 34.234 |
| 0.720138888888889 | 34.234 |
| 0.7208333333333333 | 29.823 |
| 0.7215277777777778 | 29.823 |
| 0.7222222222222222 | 29.823 |
| 0.7229166666666668 | 25.419 |
| 0.7236111111111111 | 25.419 |
| 0.7243055555555555 | 25.419 |
| 0.725 | 21.024 |
| 0.7256944444444445 | 21.024 |
| 0.7263888888888889 | 21.024 |
| 0.7270833333333333 | 16.636 |
| 0.7277777777777777 | 16.636 |
| 0.7284722222222223 | 16.636 |
| 0.7291666666666666 | 12.257 |
| 0.7298611111111111 | 12.257 |
| 0.7305555555555556 | 12.257 |
| 0.7312500000000001 | 12.257 |
| 0.7319444444444444 | 12.257 |
| 0.7326388888888888 | 7.887 |
| 0.7333333333333334 | 7.887 |
| 0.7340277777777778 | 7.887 |
| 0.7347222222222222 | 7.887 |
| 0.7354166666666666 | 3.525 |
| 0.7361111111111112 | 3.525 |
| 0.7368055555555556 | 3.525 |
| 0.7374999999999999 | 3.525 |
| 0.7381944444444444 | 3.525 |
| 0.7388888888888889 | 3.525 |
| 0.7395833333333334 | 3.525 |
| 0.7402777777777777 | 3.525 |
| 0.7409722222222223 | 0 |
| 0.7416666666666667 | 0 |
| 0.7423611111111111 | 0 |
| 0.7430555555555555 | 0 |
| 0.74375 | 0 |
| 0.7444444444444445 | 0 |
| 0.7451388888888889 | 0 |
| 0.7458333333333332 | 0 |
| 0.7465277777777778 | 0 |
| 0.7472222222222222 | 0 |
| 0.7479166666666667 | 0 |
| 0.748611111111111 | 0 |
| 0.7493055555555556 | 0 |
| 0.75 | 0 |
| 0.7506944444444444 | 0 |
| 0.751388888888889 | 0 |
| 0.7520833333333333 | 0 |
| 0.7527777777777778 | 0 |
| 0.7534722222222222 | 0 |
| 0.7541666666666668 | 0 |
| 0.7548611111111111 | 0 |
| 0.7555555555555555 | 0 |
| 0.75625 | 0 |
| 0.7569444444444445 | 0 |
| 0.7576388888888889 | 0 |
| 0.7583333333333333 | 0 |
| 0.7590277777777777 | 0 |
| 0.7597222222222223 | 0 |
| 0.7604166666666666 | 0 |
| 0.7611111111111111 | 0 |
| 0.7618055555555556 | 0 |
| 0.7625000000000001 | 0 |
| 0.7631944444444444 | 0 |
| 0.7638888888888888 | 0 |
| 0.7645833333333334 | 0 |
| 0.7652777777777778 | 0 |
| 0.7659722222222222 | 0 |
| 0.7666666666666666 | 0 |
| 0.7673611111111112 | 0 |
| 0.7680555555555556 | 0 |
| 0.7687499999999999 | 0 |
| 0.7694444444444444 | 0 |
| 0.7701388888888889 | 0 |
| 0.7708333333333334 | 0 |
| 0.7715277777777777 | 0 |
| 0.7722222222222223 | 0 |
| 0.7729166666666667 | 0 |
| 0.7736111111111111 | 0 |
| 0.7743055555555555 | 0 |
| 0.775 | 0 |
| 0.7756944444444445 | 0 |
| 0.7763888888888889 | 0 |
| 0.7770833333333332 | 0 |
| 0.7777777777777778 | 0 |
| 0.7784722222222222 | 0 |
| 0.7791666666666667 | 0 |
| 0.779861111111111 | 0 |
| 0.7805555555555556 | 0 |
| 0.78125 | 0 |
| 0.7819444444444444 | 0 |
| 0.782638888888889 | 0 |
| 0.7833333333333333 | 0 |
| 0.7840277777777778 | 0 |
| 0.7847222222222222 | 0 |
| 0.7854166666666668 | 0 |
| 0.7861111111111111 | 0 |
| 0.7868055555555555 | 0 |
| 0.7875 | 0 |
| 0.7881944444444445 | 0 |
| 0.7888888888888889 | 0 |
| 0.7895833333333333 | 0 |
| 0.7902777777777777 | 0 |
| 0.7909722222222223 | 0 |
| 0.7916666666666666 | 0 |
| 0.7923611111111111 | 0 |
| 0.7930555555555556 | 0 |
| 0.7937500000000001 | 0 |
| 0.7944444444444444 | 0 |
| 0.7951388888888888 | 0 |
| 0.7958333333333334 | 0 |
| 0.7965277777777778 | 0 |
| 0.7972222222222222 | 0 |
| 0.7979166666666666 | 0 |
| 0.7986111111111112 | 0 |
| 0.7993055555555556 | 0 |
| 0.7999999999999999 | 0 |
| 0.8006944444444444 | 0 |
| 0.8013888888888889 | 0 |
| 0.8020833333333334 | 0 |
| 0.8027777777777777 | 0 |
| 0.8034722222222223 | 0 |
| 0.8041666666666667 | 0 |
| 0.8048611111111111 | 0 |
| 0.8055555555555555 | 0 |
| 0.80625 | 0 |
| 0.8069444444444445 | 0 |
| 0.8076388888888889 | 0 |
| 0.8083333333333332 | 0 |
| 0.8090277777777778 | 0 |
| 0.8097222222222222 | 0 |
| 0.8104166666666667 | 0 |
| 0.811111111111111 | 0 |
| 0.8118055555555556 | 0 |
| 0.8125 | 0 |
| 0.8131944444444444 | 0 |
| 0.813888888888889 | 0 |
| 0.8145833333333333 | 0 |
| 0.8152777777777778 | 0 |
| 0.8159722222222222 | 0 |
| 0.8166666666666668 | 0 |
| 0.8173611111111111 | 0 |
| 0.8180555555555555 | 0 |
| 0.81875 | 0 |
| 0.8194444444444445 | 0 |
| 0.8201388888888889 | 0 |
| 0.8208333333333333 | 0 |
| 0.8215277777777777 | 0 |
| 0.8222222222222223 | 0 |
| 0.8229166666666666 | 0 |
| 0.8236111111111111 | 0 |
| 0.8243055555555556 | 0 |
| 0.8250000000000001 | 0 |
| 0.8256944444444444 | 0 |
| 0.8263888888888888 | 0 |
| 0.8270833333333334 | 0 |
| 0.8277777777777778 | 0 |
| 0.8284722222222222 | 0 |
| 0.8291666666666666 | 0 |
| 0.8298611111111112 | 0 |
| 0.8305555555555556 | 0 |
| 0.8312499999999999 | 0 |
| 0.8319444444444444 | 0 |
| 0.8326388888888889 | 0 |
| 0.8333333333333334 | 0 |
| 0.8340277777777777 | 0 |
| 0.8347222222222223 | 0 |
| 0.8354166666666667 | 0 |
| 0.8361111111111111 | 0 |
| 0.8368055555555555 | 0 |
| 0.8375 | 0 |
| 0.8381944444444445 | 0 |
| 0.8388888888888889 | 0 |
| 0.8395833333333332 | 0 |
| 0.8402777777777778 | 0 |
| 0.8409722222222222 | 0 |
| 0.8416666666666667 | 0 |
| 0.842361111111111 | 0 |
| 0.8430555555555556 | 0 |
| 0.84375 | 0 |
| 0.8444444444444444 | 0 |
| 0.845138888888889 | 0 |
| 0.8458333333333333 | 0 |
| 0.8465277777777778 | 0 |
| 0.8472222222222222 | 0 |
| 0.8479166666666668 | 0 |
| 0.8486111111111111 | 0 |
| 0.8493055555555555 | 0 |
| 0.85 | 0 |
| 0.8506944444444445 | 0 |
| 0.8513888888888889 | 0 |
| 0.8520833333333333 | 0 |
| 0.8527777777777777 | 0 |
| 0.8534722222222223 | 0 |
| 0.8541666666666666 | 0 |
| 0.8548611111111111 | 0 |
| 0.8555555555555556 | 0 |
| 0.8562500000000001 | 0 |
| 0.8569444444444444 | 0 |
| 0.8576388888888888 | 0 |
| 0.8583333333333334 | 0 |
| 0.8590277777777778 | 0 |
| 0.8597222222222222 | 0 |
| 0.8604166666666666 | 0 |
| 0.8611111111111112 | 0 |
| 0.8618055555555556 | 0 |
| 0.8624999999999999 | 0 |
| 0.8631944444444444 | 0 |
| 0.8638888888888889 | 0 |
| 0.8645833333333334 | 0 |
| 0.8652777777777777 | 0 |
| 0.8659722222222223 | 0 |
| 0.8666666666666667 | 0 |
| 0.8673611111111111 | 0 |
| 0.8680555555555555 | 0 |
| 0.86875 | 0 |
| 0.8694444444444445 | 0 |
| 0.8701388888888889 | 0 |
| 0.8708333333333332 | 0 |
| 0.8715277777777778 | 0 |
| 0.8722222222222222 | 0 |
| 0.8729166666666667 | 0 |
| 0.873611111111111 | 0 |
| 0.8743055555555556 | 0 |
| 0.875 | 0 |
| 0.8756944444444444 | 0 |
| 0.876388888888889 | 0 |
| 0.8770833333333333 | 0 |
| 0.8777777777777778 | 0 |
| 0.8784722222222222 | 0 |
| 0.8791666666666668 | 0 |
| 0.8798611111111111 | 0 |
| 0.8805555555555555 | 0 |
| 0.88125 | 0 |
| 0.8819444444444445 | 0 |
| 0.8826388888888889 | 0 |
| 0.8833333333333333 | 0 |
| 0.8840277777777777 | 0 |
| 0.8847222222222223 | 0 |
| 0.8854166666666666 | 0 |
| 0.8861111111111111 | 0 |
| 0.8868055555555556 | 0 |
| 0.8875000000000001 | 0 |
| 0.8881944444444444 | 0 |
| 0.8888888888888888 | 0 |
| 0.8895833333333334 | 0 |
| 0.8902777777777778 | 0 |
| 0.8909722222222222 | 0 |
| 0.8916666666666666 | 0 |
| 0.8923611111111112 | 0 |
| 0.8930555555555556 | 0 |
| 0.8937499999999999 | 0 |
| 0.8944444444444444 | 0 |
| 0.8951388888888889 | 0 |
| 0.8958333333333334 | 0 |
| 0.8965277777777777 | 0 |
| 0.8972222222222223 | 0 |
| 0.8979166666666667 | 0 |
| 0.8986111111111111 | 0 |
| 0.8993055555555555 | 0 |
| 0.9 | 0 |
| 0.9006944444444445 | 0 |
| 0.9013888888888889 | 0 |
| 0.9020833333333332 | 0 |
| 0.9027777777777778 | 0 |
| 0.9034722222222222 | 0 |
| 0.9041666666666667 | 0 |
| 0.904861111111111 | 0 |
| 0.9055555555555556 | 0 |
| 0.90625 | 0 |
| 0.9069444444444444 | 0 |
| 0.907638888888889 | 0 |
| 0.9083333333333333 | 0 |
| 0.9090277777777778 | 0 |
| 0.9097222222222222 | 0 |
| 0.9104166666666668 | 0 |
| 0.9111111111111111 | 0 |
| 0.9118055555555555 | 0 |
| 0.9125 | 0 |
| 0.9131944444444445 | 0 |
| 0.9138888888888889 | 0 |
| 0.9145833333333333 | 0 |
| 0.9152777777777777 | 0 |
| 0.9159722222222223 | 0 |
| 0.9166666666666666 | 0 |
| 0.9173611111111111 | 0 |
| 0.9180555555555556 | 0 |
| 0.9187500000000001 | 0 |
| 0.9194444444444444 | 0 |
| 0.9201388888888888 | 0 |
| 0.9208333333333334 | 0 |
| 0.9215277777777778 | 0 |
| 0.9222222222222222 | 0 |
| 0.9229166666666666 | 0 |
| 0.9236111111111112 | 0 |
| 0.9243055555555556 | 0 |
| 0.9249999999999999 | 0 |
| 0.9256944444444444 | 0 |
| 0.9263888888888889 | 0 |
| 0.9270833333333334 | 0 |
| 0.9277777777777777 | 0 |
| 0.9284722222222223 | 0 |
| 0.9291666666666667 | 0 |
| 0.9298611111111111 | 0 |
| 0.9305555555555555 | 0 |
| 0.93125 | 0 |
| 0.9319444444444445 | 0 |
| 0.9326388888888889 | 0 |
| 0.9333333333333332 | 0 |
| 0.9340277777777778 | 0 |
| 0.9347222222222222 | 0 |
| 0.9354166666666667 | 0 |
| 0.936111111111111 | 0 |
| 0.9368055555555556 | 0 |
| 0.9375 | 0 |
| 0.9381944444444444 | 0 |
| 0.938888888888889 | 0 |
| 0.9395833333333333 | 0 |
| 0.9402777777777778 | 0 |
| 0.9409722222222222 | 0 |
| 0.9416666666666668 | 0 |
| 0.9423611111111111 | 0 |
| 0.9430555555555555 | 0 |
| 0.94375 | 0 |
| 0.9444444444444445 | 0 |
| 0.9451388888888889 | 0 |
| 0.9458333333333333 | 0 |
| 0.9465277777777777 | 0 |
| 0.9472222222222223 | 0 |
| 0.9479166666666666 | 0 |
| 0.9486111111111111 | 0 |
| 0.9493055555555556 | 0 |
| 0.9500000000000001 | 0 |
| 0.9506944444444444 | 0 |
| 0.9513888888888888 | 0 |
| 0.9520833333333334 | 0 |
| 0.9527777777777778 | 0 |
| 0.9534722222222222 | 0 |
| 0.9541666666666666 | 0 |
| 0.9548611111111112 | 0 |
| 0.9555555555555556 | 0 |
| 0.9562499999999999 | 0 |
| 0.9569444444444444 | 0 |
| 0.9576388888888889 | 0 |
| 0.9583333333333334 | 0 |
| 0.9590277777777777 | 0 |
| 0.9597222222222223 | 0 |
| 0.9604166666666667 | 0 |
| 0.9611111111111111 | 0 |
| 0.9618055555555555 | 0 |
| 0.9625 | 0 |
| 0.9631944444444445 | 0 |
| 0.9638888888888889 | 0 |
| 0.9645833333333332 | 0 |
| 0.9652777777777778 | 0 |
| 0.9659722222222222 | 0 |
| 0.9666666666666667 | 0 |
| 0.967361111111111 | 0 |
| 0.9680555555555556 | 0 |
| 0.96875 | 0 |
| 0.9694444444444444 | 0 |
| 0.970138888888889 | 0 |
| 0.9708333333333333 | 0 |
| 0.9715277777777778 | 0 |
| 0.9722222222222222 | 0 |
| 0.9729166666666668 | 0 |
| 0.9736111111111111 | 0 |
| 0.9743055555555555 | 0 |
| 0.975 | 0 |
| 0.9756944444444445 | 0 |
| 0.9763888888888889 | 0 |
| 0.9770833333333333 | 0 |
| 0.9777777777777777 | 0 |
| 0.9784722222222223 | 0 |
| 0.9791666666666666 | 0 |
| 0.9798611111111111 | 0 |
| 0.9805555555555556 | 0 |
| 0.9812500000000001 | 0 |
| 0.9819444444444444 | 0 |
| 0.9826388888888888 | 0 |
| 0.9833333333333334 | 0 |
| 0.9840277777777778 | 0 |
| 0.9847222222222222 | 0 |
| 0.9854166666666666 | 0 |
| 0.9861111111111112 | 0 |
| 0.9868055555555556 | 0 |
| 0.9874999999999999 | 0 |
| 0.9881944444444444 | 0 |
| 0.9888888888888889 | 0 |
| 0.9895833333333334 | 0 |
| 0.9902777777777777 | 0 |
| 0.9909722222222223 | 0 |
| 0.9916666666666667 | 0 |
| 0.9923611111111111 | 0 |
| 0.9930555555555555 | 0 |
| 0.99375 | 0 |
| 0.9944444444444445 | 0 |
| 0.9951388888888889 | 0 |
| 0.9958333333333332 | 0 |
| 0.9965277777777778 | 0 |
| 0.9972222222222222 | 0 |
| 0.9979166666666667 | 0 |
| 0.998611111111111 | 0 |
| 0.9993055555555556 | 0 |